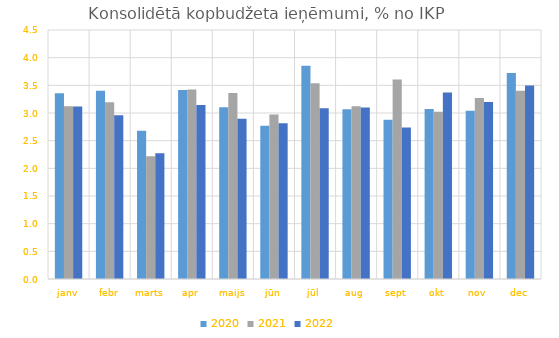
| Category | 2020 | 2021 | 2022 |
|---|---|---|---|
| janv | 3.356 | 3.121 | 3.119 |
| febr | 3.402 | 3.195 | 2.957 |
| marts | 2.68 | 2.219 | 2.272 |
| apr | 3.417 | 3.426 | 3.145 |
| maijs | 3.103 | 3.36 | 2.895 |
| jūn | 2.77 | 2.971 | 2.815 |
| jūl | 3.854 | 3.537 | 3.087 |
| aug | 3.069 | 3.121 | 3.099 |
| sept | 2.876 | 3.605 | 2.736 |
| okt | 3.071 | 3.023 | 3.369 |
| nov | 3.04 | 3.271 | 3.2 |
| dec | 3.723 | 3.404 | 3.498 |